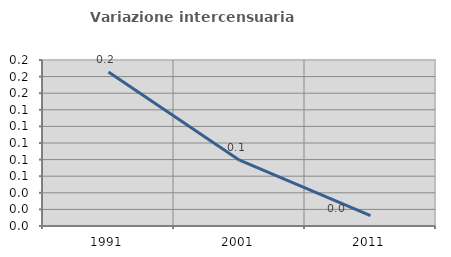
| Category | Variazione intercensuaria annua |
|---|---|
| 1991.0 | 0.185 |
| 2001.0 | 0.079 |
| 2011.0 | 0.012 |